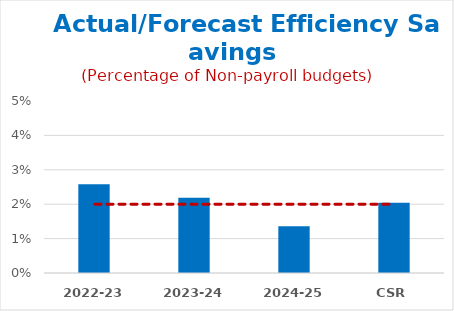
| Category | Forecast Efficiency Savings |
|---|---|
| 2022-23 | 0.026 |
| 2023-24 | 0.022 |
| 2024-25 | 0.014 |
| CSR | 0.02 |